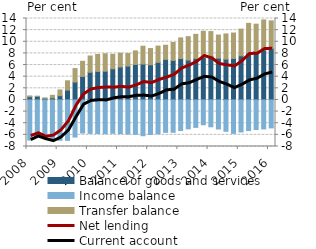
| Category | Balance of goods and services | Income balance | Transfer balance |
|---|---|---|---|
| 2008.0 | 0.545 | -6.893 | 0.145 |
| 2008.0 | 0.611 | -6.354 | 0.016 |
| 2008.0 | 0.277 | -6.665 | 0.057 |
| 2008.0 | 0.358 | -6.913 | 0.436 |
| 2009.0 | 0.729 | -6.937 | 0.988 |
| 2009.0 | 1.7 | -6.942 | 1.591 |
| 2009.0 | 3.071 | -6.372 | 2.32 |
| 2009.0 | 4.043 | -5.685 | 2.6 |
| 2010.0 | 4.753 | -5.745 | 2.802 |
| 2010.0 | 4.906 | -5.77 | 2.915 |
| 2010.0 | 4.937 | -5.789 | 2.995 |
| 2010.0 | 5.357 | -5.732 | 2.484 |
| 2011.0 | 5.668 | -5.787 | 2.368 |
| 2011.0 | 5.818 | -5.859 | 2.159 |
| 2011.0 | 6.112 | -5.909 | 2.323 |
| 2011.0 | 6.17 | -6.147 | 3.062 |
| 2012.0 | 6.051 | -5.94 | 2.78 |
| 2012.0 | 6.46 | -5.821 | 2.799 |
| 2012.0 | 6.976 | -5.568 | 2.43 |
| 2012.0 | 6.79 | -5.563 | 3.086 |
| 2013.0 | 7.117 | -5.258 | 3.546 |
| 2013.0 | 6.851 | -4.97 | 4.029 |
| 2013.0 | 7.131 | -4.712 | 4.146 |
| 2013.0 | 7.296 | -4.263 | 4.515 |
| 2014.0 | 7.48 | -4.611 | 4.271 |
| 2014.0 | 7.189 | -4.992 | 3.97 |
| 2014.0 | 7.015 | -5.384 | 4.327 |
| 2014.0 | 7.146 | -5.742 | 4.354 |
| 2015.0 | 7.591 | -5.504 | 4.582 |
| 2015.0 | 8.051 | -5.259 | 5.114 |
| 2015.0 | 8.305 | -5.083 | 4.721 |
| 2015.0 | 8.596 | -4.984 | 5.156 |
| 2016.0 | 8.832 | -4.805 | 4.76 |